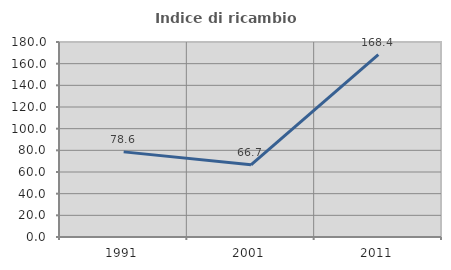
| Category | Indice di ricambio occupazionale  |
|---|---|
| 1991.0 | 78.571 |
| 2001.0 | 66.667 |
| 2011.0 | 168.421 |